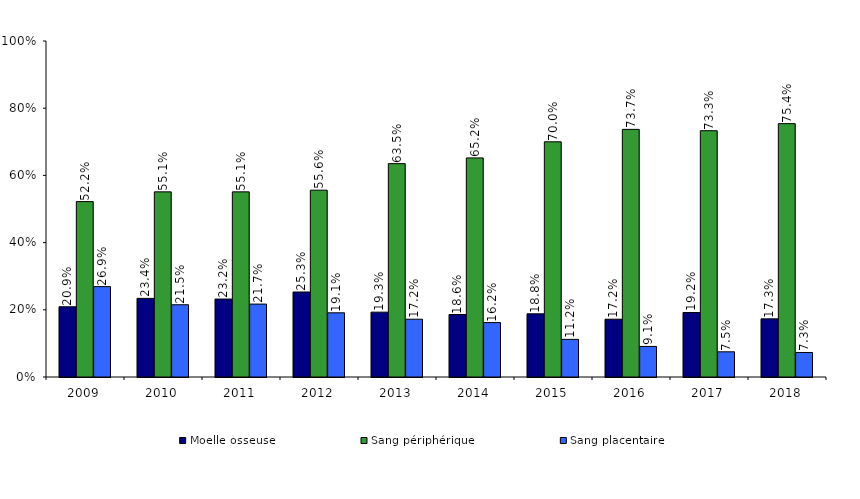
| Category | Moelle osseuse | Sang périphérique | Sang placentaire |
|---|---|---|---|
| 2009.0 | 0.209 | 0.522 | 0.269 |
| 2010.0 | 0.234 | 0.551 | 0.215 |
| 2011.0 | 0.232 | 0.551 | 0.217 |
| 2012.0 | 0.253 | 0.556 | 0.191 |
| 2013.0 | 0.193 | 0.635 | 0.172 |
| 2014.0 | 0.186 | 0.652 | 0.162 |
| 2015.0 | 0.188 | 0.7 | 0.112 |
| 2016.0 | 0.172 | 0.737 | 0.091 |
| 2017.0 | 0.192 | 0.733 | 0.075 |
| 2018.0 | 0.173 | 0.754 | 0.073 |